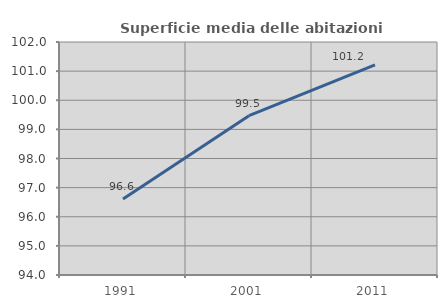
| Category | Superficie media delle abitazioni occupate |
|---|---|
| 1991.0 | 96.609 |
| 2001.0 | 99.469 |
| 2011.0 | 101.215 |